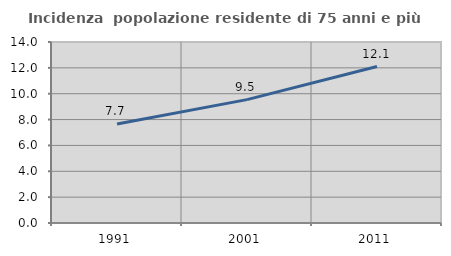
| Category | Incidenza  popolazione residente di 75 anni e più |
|---|---|
| 1991.0 | 7.661 |
| 2001.0 | 9.544 |
| 2011.0 | 12.099 |